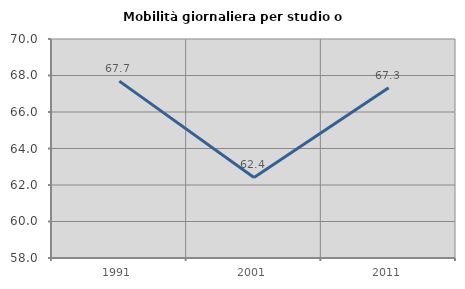
| Category | Mobilità giornaliera per studio o lavoro |
|---|---|
| 1991.0 | 67.691 |
| 2001.0 | 62.413 |
| 2011.0 | 67.331 |